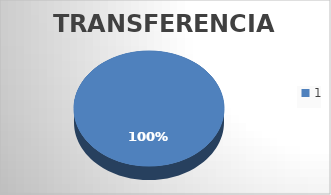
| Category | Transferencias |
|---|---|
| 0 | 3 |